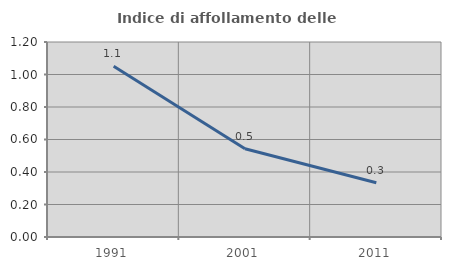
| Category | Indice di affollamento delle abitazioni  |
|---|---|
| 1991.0 | 1.051 |
| 2001.0 | 0.543 |
| 2011.0 | 0.334 |